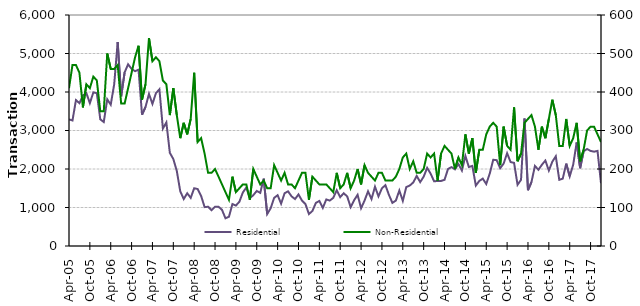
| Category | Residential |
|---|---|
| 2005-04-01 | 3290 |
| 2005-05-01 | 3260 |
| 2005-06-01 | 3790 |
| 2005-07-01 | 3710 |
| 2005-08-01 | 3910 |
| 2005-09-01 | 3970 |
| 2005-10-01 | 3710 |
| 2005-11-01 | 3990 |
| 2005-12-01 | 3970 |
| 2006-01-01 | 3290 |
| 2006-02-01 | 3220 |
| 2006-03-01 | 3810 |
| 2006-04-01 | 3670 |
| 2006-05-01 | 4200 |
| 2006-06-01 | 5300 |
| 2006-07-01 | 3890 |
| 2006-08-01 | 4510 |
| 2006-09-01 | 4720 |
| 2006-10-01 | 4600 |
| 2006-11-01 | 4540 |
| 2006-12-01 | 4580 |
| 2007-01-01 | 3410 |
| 2007-02-01 | 3610 |
| 2007-03-01 | 3950 |
| 2007-04-01 | 3690 |
| 2007-05-01 | 3970 |
| 2007-06-01 | 4070 |
| 2007-07-01 | 3050 |
| 2007-08-01 | 3210 |
| 2007-09-01 | 2420 |
| 2007-10-01 | 2260 |
| 2007-11-01 | 1950 |
| 2007-12-01 | 1420 |
| 2008-01-01 | 1220 |
| 2008-02-01 | 1370 |
| 2008-03-01 | 1250 |
| 2008-04-01 | 1500 |
| 2008-05-01 | 1480 |
| 2008-06-01 | 1300 |
| 2008-07-01 | 1010 |
| 2008-08-01 | 1020 |
| 2008-09-01 | 930 |
| 2008-10-01 | 1020 |
| 2008-11-01 | 1020 |
| 2008-12-01 | 940 |
| 2009-01-01 | 720 |
| 2009-02-01 | 760 |
| 2009-03-01 | 1090 |
| 2009-04-01 | 1050 |
| 2009-05-01 | 1150 |
| 2009-06-01 | 1390 |
| 2009-07-01 | 1520 |
| 2009-08-01 | 1240 |
| 2009-09-01 | 1320 |
| 2009-10-01 | 1430 |
| 2009-11-01 | 1380 |
| 2009-12-01 | 1750 |
| 2010-01-01 | 830 |
| 2010-02-01 | 980 |
| 2010-03-01 | 1250 |
| 2010-04-01 | 1320 |
| 2010-05-01 | 1100 |
| 2010-06-01 | 1370 |
| 2010-07-01 | 1420 |
| 2010-08-01 | 1290 |
| 2010-09-01 | 1220 |
| 2010-10-01 | 1340 |
| 2010-11-01 | 1180 |
| 2010-12-01 | 1090 |
| 2011-01-01 | 830 |
| 2011-02-01 | 910 |
| 2011-03-01 | 1120 |
| 2011-04-01 | 1170 |
| 2011-05-01 | 990 |
| 2011-06-01 | 1210 |
| 2011-07-01 | 1180 |
| 2011-08-01 | 1250 |
| 2011-09-01 | 1450 |
| 2011-10-01 | 1270 |
| 2011-11-01 | 1370 |
| 2011-12-01 | 1290 |
| 2012-01-01 | 1010 |
| 2012-02-01 | 1190 |
| 2012-03-01 | 1330 |
| 2012-04-01 | 980 |
| 2012-05-01 | 1180 |
| 2012-06-01 | 1420 |
| 2012-07-01 | 1220 |
| 2012-08-01 | 1540 |
| 2012-09-01 | 1290 |
| 2012-10-01 | 1500 |
| 2012-11-01 | 1580 |
| 2012-12-01 | 1330 |
| 2013-01-01 | 1120 |
| 2013-02-01 | 1180 |
| 2013-03-01 | 1440 |
| 2013-04-01 | 1170 |
| 2013-05-01 | 1530 |
| 2013-06-01 | 1570 |
| 2013-07-01 | 1650 |
| 2013-08-01 | 1820 |
| 2013-09-01 | 1660 |
| 2013-10-01 | 1800 |
| 2013-11-01 | 2030 |
| 2013-12-01 | 1880 |
| 2014-01-01 | 1680 |
| 2014-02-01 | 1690 |
| 2014-03-01 | 1690 |
| 2014-04-01 | 1720 |
| 2014-05-01 | 2000 |
| 2014-06-01 | 2050 |
| 2014-07-01 | 1990 |
| 2014-08-01 | 2130 |
| 2014-09-01 | 1960 |
| 2014-10-01 | 2340 |
| 2014-11-01 | 2050 |
| 2014-12-01 | 2080 |
| 2015-01-01 | 1570 |
| 2015-02-01 | 1690 |
| 2015-03-01 | 1750 |
| 2015-04-01 | 1610 |
| 2015-05-01 | 1880 |
| 2015-06-01 | 2240 |
| 2015-07-01 | 2230 |
| 2015-08-01 | 2020 |
| 2015-09-01 | 2140 |
| 2015-10-01 | 2410 |
| 2015-11-01 | 2180 |
| 2015-12-01 | 2160 |
| 2016-01-01 | 1590 |
| 2016-02-01 | 1720 |
| 2016-03-01 | 3310 |
| 2016-04-01 | 1450 |
| 2016-05-01 | 1660 |
| 2016-06-01 | 2080 |
| 2016-07-01 | 1980 |
| 2016-08-01 | 2110 |
| 2016-09-01 | 2220 |
| 2016-10-01 | 1960 |
| 2016-11-01 | 2190 |
| 2016-12-01 | 2330 |
| 2017-01-01 | 1720 |
| 2017-02-01 | 1750 |
| 2017-03-01 | 2140 |
| 2017-04-01 | 1810 |
| 2017-05-01 | 2110 |
| 2017-06-01 | 2690 |
| 2017-07-01 | 2020 |
| 2017-08-01 | 2460 |
| 2017-09-01 | 2520 |
| 2017-10-01 | 2470 |
| 2017-11-01 | 2450 |
| 2017-12-01 | 2470 |
| 2018-01-01 | 1630 |